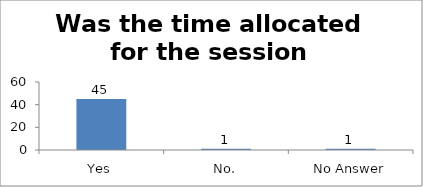
| Category | Was the time allocated for the session sufficient? |
|---|---|
| Yes | 45 |
| No. | 1 |
| No Answer | 1 |